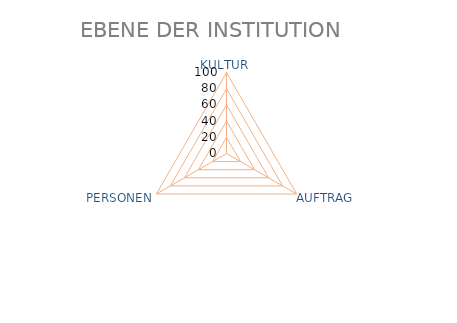
| Category | "Dimensions" |
|---|---|
| KULTUR | 0 |
| AUFTRAG | 0 |
| PERSONEN | 0 |